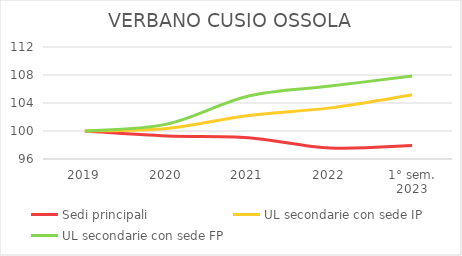
| Category | Sedi principali | UL secondarie con sede IP | UL secondarie con sede FP |
|---|---|---|---|
| 2019 | 100 | 100 | 100 |
| 2020 | 99.299 | 100.359 | 100.98 |
| 2021 | 99.044 | 102.225 | 104.991 |
| 2022 | 97.575 | 103.302 | 106.417 |
| 1° sem.
2023 | 97.939 | 105.169 | 107.843 |